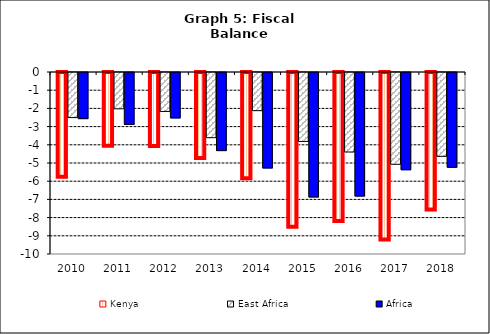
| Category | Kenya | East Africa | Africa |
|---|---|---|---|
| 2010.0 | -5.813 | -2.477 | -2.535 |
| 2011.0 | -4.112 | -1.995 | -2.853 |
| 2012.0 | -4.128 | -2.14 | -2.495 |
| 2013.0 | -4.78 | -3.581 | -4.291 |
| 2014.0 | -5.897 | -2.096 | -5.245 |
| 2015.0 | -8.553 | -3.788 | -6.84 |
| 2016.0 | -8.235 | -4.368 | -6.79 |
| 2017.0 | -9.264 | -5.043 | -5.342 |
| 2018.0 | -7.61 | -4.606 | -5.208 |